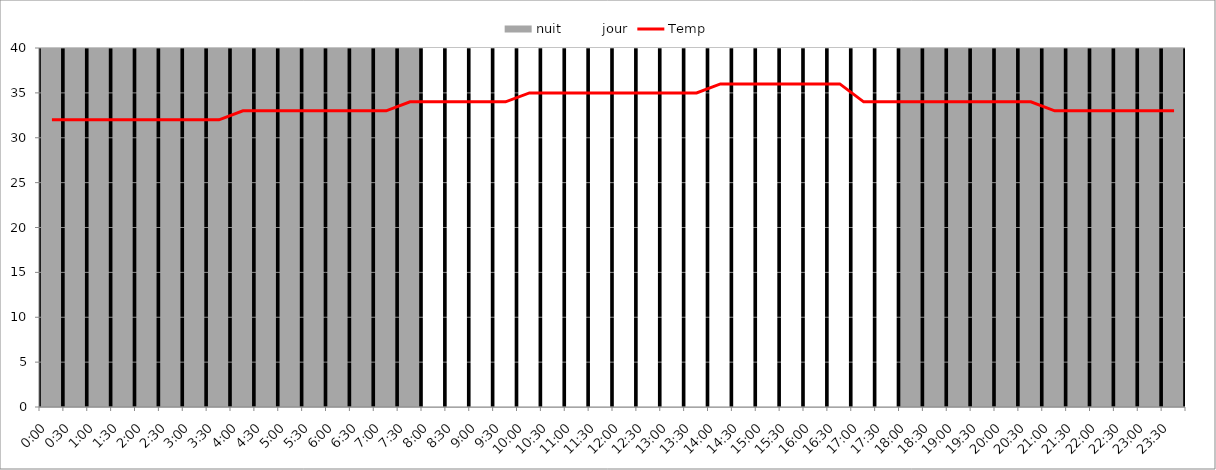
| Category | nuit | jour |
|---|---|---|
| 0.0 | 40 | 0 |
| 0.020833333333333332 | 40 | 0 |
| 0.0416666666666667 | 40 | 0 |
| 0.0625 | 40 | 0 |
| 0.0833333333333333 | 40 | 0 |
| 0.104166666666667 | 40 | 0 |
| 0.125 | 40 | 0 |
| 0.145833333333333 | 40 | 0 |
| 0.166666666666667 | 40 | 0 |
| 0.1875 | 40 | 0 |
| 0.208333333333333 | 40 | 0 |
| 0.229166666666667 | 40 | 0 |
| 0.25 | 40 | 0 |
| 0.270833333333333 | 40 | 0 |
| 0.291666666666667 | 40 | 0 |
| 0.3125 | 40 | 0 |
| 0.333333333333333 | 0 | 40 |
| 0.354166666666667 | 0 | 40 |
| 0.375 | 0 | 40 |
| 0.395833333333333 | 0 | 40 |
| 0.416666666666667 | 0 | 40 |
| 0.4375 | 0 | 40 |
| 0.458333333333333 | 0 | 40 |
| 0.479166666666667 | 0 | 40 |
| 0.5 | 0 | 40 |
| 0.520833333333333 | 0 | 40 |
| 0.541666666666667 | 0 | 40 |
| 0.5625 | 0 | 40 |
| 0.583333333333333 | 0 | 40 |
| 0.604166666666667 | 0 | 40 |
| 0.625 | 0 | 40 |
| 0.645833333333333 | 0 | 40 |
| 0.666666666666667 | 0 | 40 |
| 0.6875 | 0 | 40 |
| 0.708333333333333 | 0 | 40 |
| 0.729166666666667 | 0 | 40 |
| 0.75 | 40 | 0 |
| 0.770833333333333 | 40 | 0 |
| 0.791666666666667 | 40 | 0 |
| 0.8125 | 40 | 0 |
| 0.833333333333333 | 40 | 0 |
| 0.854166666666667 | 40 | 0 |
| 0.875 | 40 | 0 |
| 0.895833333333333 | 40 | 0 |
| 0.916666666666667 | 40 | 0 |
| 0.9375 | 40 | 0 |
| 0.958333333333333 | 40 | 0 |
| 0.979166666666667 | 40 | 0 |